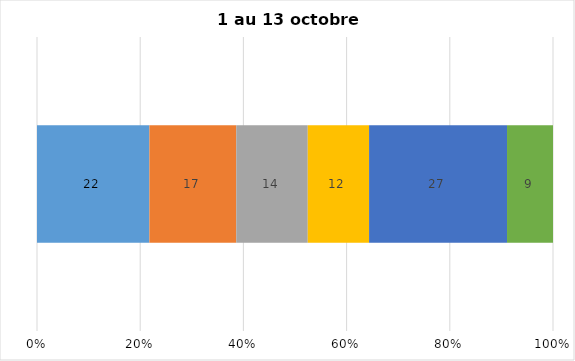
| Category | Plusieurs fois par jour | Une fois par jour | Quelques fois par semaine   | Une fois par semaine ou moins   |  Jamais   |  Je n’utilise pas les médias sociaux |
|---|---|---|---|---|---|---|
| 0 | 22 | 17 | 14 | 12 | 27 | 9 |